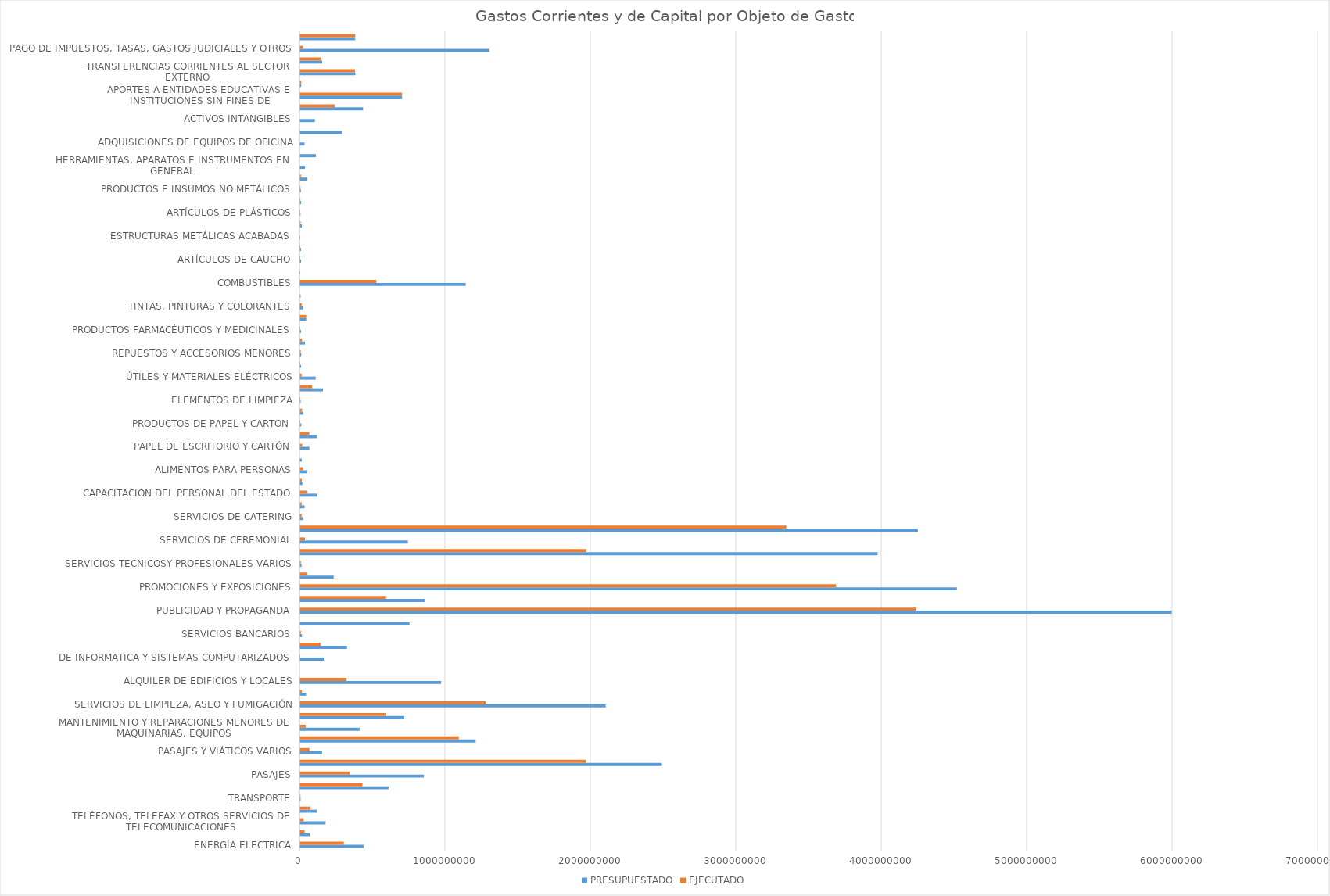
| Category | PRESUPUESTADO | EJECUTADO |
|---|---|---|
| ENERGÍA ELECTRICA | 435000000 | 299077115 |
| AGUA | 64950000 | 29760401 |
| TELÉFONOS, TELEFAX Y OTROS SERVICIOS DE
TELECOMUNICACIONES | 174050000 | 23307316 |
| CORREOS Y OTROS SERVICIOS POSTALES | 114500000 | 70250000 |
| TRANSPORTE | 2000000 | 1680000 |
| TRANSPORTE DE PERSONAS | 607000000 | 427619700 |
| PASAJES | 850000000 | 340392849 |
| VIÁTICOS Y MOVILIDAD | 2486633884 | 1964373259 |
| PASAJES Y VIÁTICOS VARIOS | 150000000 | 63106590 |
| MANTENIMIENTO Y REPARACIONES MENORES DE
EDIFICIOS Y LOCALES | 1206065198 | 1089745322 |
| MANTENIMIENTO Y REPARACIONES MENORES DE
MAQUINARIAS, EQUIPOS | 408000000 | 36941154 |
| MANTENIMIENTO Y REPARACIONES MENORES DE
EQUIPOS DE TRANSPORT | 714600000 | 591099774 |
| SERVICIOS DE LIMPIEZA, ASEO Y FUMIGACIÓN | 2100440136 | 1274476923 |
| MANTENIMIENTO Y REPARACIONES MENORES DE
INSTALACIONES | 40000000 | 11200000 |
| ALQUILER DE EDIFICIOS Y LOCALES | 969000000 | 317783034 |
| ALQUILER DE FOTOCOPIADORAS | 0 | 0 |
| DE INFORMATICA Y SISTEMAS COMPUTARIZADOS | 167000000 | 200000 |
| IMPRENTA, PUBLICACIONES Y REPRODUCCIONES | 321217400 | 140619700 |
| SERVICIOS BANCARIOS | 11106916 | 4468944 |
| PRIMAS Y GASTOS DE SEGUROS | 751000000 | 0 |
| PUBLICIDAD Y PROPAGANDA | 5992277953 | 4237275875 |
| CONSULTORIAS, ASESORIAS E INVESTIGACIONES | 857482320 | 590084164 |
| PROMOCIONES Y EXPOSICIONES | 4515000000 | 3684830500 |
| SERVICIOS DE COMUNICACIONES | 230000000 | 45555281 |
| SERVICIOS TECNICOSY PROFESIONALES VARIOS | 8500000 | 3747514 |
| SERVICIOS DE SEGURO MEDICO | 3970000000 | 1966120000 |
| SERVICIOS DE CEREMONIAL | 740000000 | 32354000 |
| SERVICIOS DE VIGILANCIA | 4246462992 | 3342578458 |
| SERVICIOS DE CATERING | 20000000 | 9315100 |
| SERVICIOS EN GENERAL | 30000000 | 10098000 |
| CAPACITACIÓN DEL PERSONAL DEL ESTADO | 116581550 | 46075000 |
| CAPACITACIÓN ESPECIALIZADA | 15000000 | 10350000 |
| ALIMENTOS PARA PERSONAS | 47333845 | 19137523 |
| CONFECCIONES TEXTILES | 10000000 | 0 |
| PAPEL DE ESCRITORIO Y CARTÓN | 63000000 | 13315800 |
| PRODUCTOS DE ARTES GRAFICAS | 115000000 | 62187520 |
| PRODUCTOS DE PAPEL Y CARTON | 7000000 | 260872 |
| LIBROS, REVISTAS Y PERIÓDICOS | 20000000 | 12509000 |
| ELEMENTOS DE LIMPIEZA | 2610000 | 321350 |
| ÚTILES DE ESCRITORIO, OFICINA Y ENSERES | 155786755 | 81678945 |
| ÚTILES Y MATERIALES ELÉCTRICOS | 106060000 | 9683208 |
| PRODUCTOS DE VIDRIO, LOZA Y PORCELANA | 5850000 | 240000 |
| REPUESTOS Y ACCESORIOS MENORES | 7000000 | 2926500 |
| COMPUESTOS QUÍMICOS | 32383000 | 12820500 |
| PRODUCTOS FARMACÉUTICOS Y MEDICINALES | 5000000 | 96900 |
| INSECTICIDAS, FUMIGANTES Y OTROS | 41250000 | 41194320 |
| TINTAS, PINTURAS Y COLORANTES | 16600000 | 9577250 |
| ÚTILES Y MATERIALES MÉDICO-QUIRÚRGICOS Y DE
LABORATORIO | 2400000 | 0 |
| COMBUSTIBLES | 1137784000 | 523174253 |
| LUBRICANTES | 201000 | 0 |
| ARTÍCULOS DE CAUCHO | 5550000 | 508000 |
| CUBIERTAS Y CÁMARAS DE AIRE | 5090000 | 250000 |
| ESTRUCTURAS METÁLICAS ACABADAS | 293800 | 0 |
| HERRAMIENTAS MENORES | 10440000 | 2069150 |
| ARTÍCULOS DE PLÁSTICOS | 1710000 | 242700 |
| PRODUCTOS E INSUMOS METÁLICOS | 5954700 | 954700 |
| PRODUCTOS E INSUMOS NO METÁLICOS | 3820900 | 1720900 |
| BIENES DE CONSUMO VARIOS | 45540000 | 4477300 |
| HERRAMIENTAS, APARATOS E INSTRUMENTOS EN
GENERAL | 32800000 | 0 |
| ADQUISICIONES DE MUEBLES Y ENSERES | 108000000 | 0 |
| ADQUISICIONES DE EQUIPOS DE OFICINA | 30000000 | 0 |
| ADQUISICIONES DE EQUIPOS DE COMPUTACIÓN | 287500000 | 0 |
| ACTIVOS INTANGIBLES | 100000000 | 0 |
| BECAS | 432000000 | 238140000 |
| APORTES A ENTIDADES EDUCATIVAS E
INSTITUCIONES SIN FINES DE | 700000000 | 700000000 |
| OTRAS TRANSFERENCIAS CORRIENTES | 6100000 | 6100000 |
| TRANSFERENCIAS CORRIENTES AL SECTOR
EXTERNO | 379000000 | 376174096 |
| TRANSFERENCIAS CTES. A ENT. DEL SECTOR
PRIVADO, ACADEMICO Y/ | 151000000 | 143813340 |
| PAGO DE IMPUESTOS, TASAS, GASTOS JUDICIALES Y OTROS | 1299860316 | 18485499 |
| DEUDAS PENDIENTES DE PAGO DE GASTOS
CORRIENTES DE EJERCICIOS | 377785000 | 377785000 |